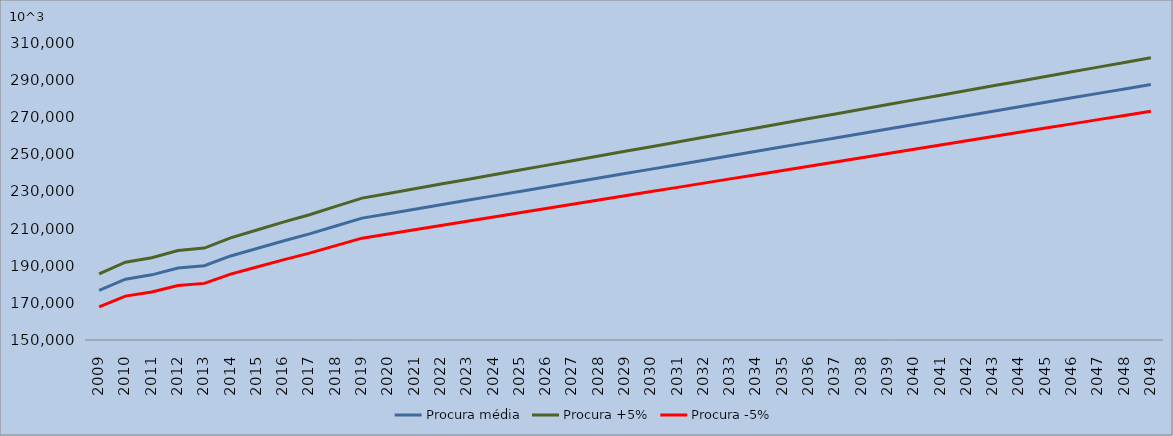
| Category | Procura média | Procura +5% | Procura -5% |
|---|---|---|---|
| 2009.0 | 176726 | 185562.3 | 167889.7 |
| 2010.0 | 182781 | 191920.05 | 173641.95 |
| 2011.0 | 185100 | 194355 | 175845 |
| 2012.0 | 188800 | 198240 | 179360 |
| 2013.0 | 190000 | 199500 | 180500 |
| 2014.0 | 195274 | 205037.7 | 185510.3 |
| 2015.0 | 199305 | 209270.25 | 189339.75 |
| 2016.0 | 203335 | 213501.75 | 193168.25 |
| 2017.0 | 207142 | 217499.1 | 196784.9 |
| 2018.0 | 211397 | 221966.85 | 200827.15 |
| 2019.0 | 215652 | 226434.6 | 204869.4 |
| 2020.0 | 218052.133 | 228954.74 | 207149.527 |
| 2021.0 | 220452.267 | 231474.88 | 209429.653 |
| 2022.0 | 222852.4 | 233995.02 | 211709.78 |
| 2023.0 | 225252.533 | 236515.16 | 213989.907 |
| 2024.0 | 227652.667 | 239035.3 | 216270.033 |
| 2025.0 | 230052.8 | 241555.44 | 218550.16 |
| 2026.0 | 232452.933 | 244075.58 | 220830.287 |
| 2027.0 | 234853.067 | 246595.72 | 223110.413 |
| 2028.0 | 237253.2 | 249115.86 | 225390.54 |
| 2029.0 | 239653.333 | 251636 | 227670.667 |
| 2030.0 | 242053.467 | 254156.14 | 229950.793 |
| 2031.0 | 244453.6 | 256676.28 | 232230.92 |
| 2032.0 | 246853.733 | 259196.42 | 234511.047 |
| 2033.0 | 249253.867 | 261716.56 | 236791.173 |
| 2034.0 | 251654 | 264236.7 | 239071.3 |
| 2035.0 | 254054.133 | 266756.84 | 241351.427 |
| 2036.0 | 256454.267 | 269276.98 | 243631.553 |
| 2037.0 | 258854.4 | 271797.12 | 245911.68 |
| 2038.0 | 261254.533 | 274317.26 | 248191.807 |
| 2039.0 | 263654.667 | 276837.4 | 250471.933 |
| 2040.0 | 266054.8 | 279357.54 | 252752.06 |
| 2041.0 | 268454.933 | 281877.68 | 255032.187 |
| 2042.0 | 270855.067 | 284397.82 | 257312.313 |
| 2043.0 | 273255.2 | 286917.96 | 259592.44 |
| 2044.0 | 275655.333 | 289438.1 | 261872.567 |
| 2045.0 | 278055.467 | 291958.24 | 264152.693 |
| 2046.0 | 280455.6 | 294478.38 | 266432.82 |
| 2047.0 | 282855.733 | 296998.52 | 268712.947 |
| 2048.0 | 285255.867 | 299518.66 | 270993.073 |
| 2049.0 | 287656 | 302038.8 | 273273.2 |